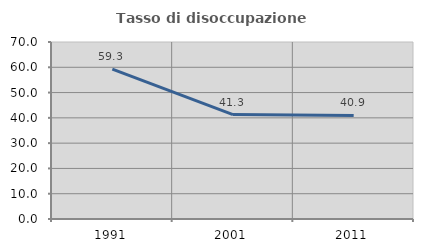
| Category | Tasso di disoccupazione giovanile  |
|---|---|
| 1991.0 | 59.276 |
| 2001.0 | 41.308 |
| 2011.0 | 40.948 |